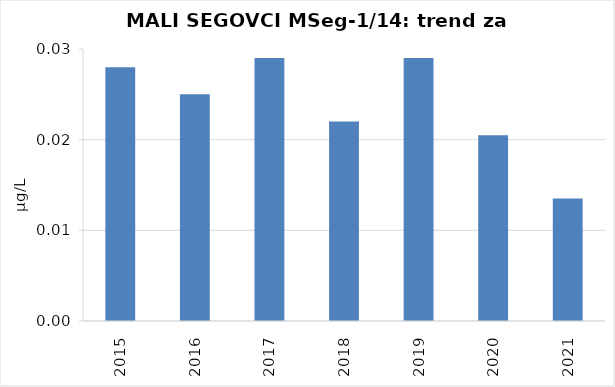
| Category | Vsota |
|---|---|
| 2015 | 0.028 |
| 2016 | 0.025 |
| 2017 | 0.029 |
| 2018 | 0.022 |
| 2019 | 0.029 |
| 2020 | 0.02 |
| 2021 | 0.014 |